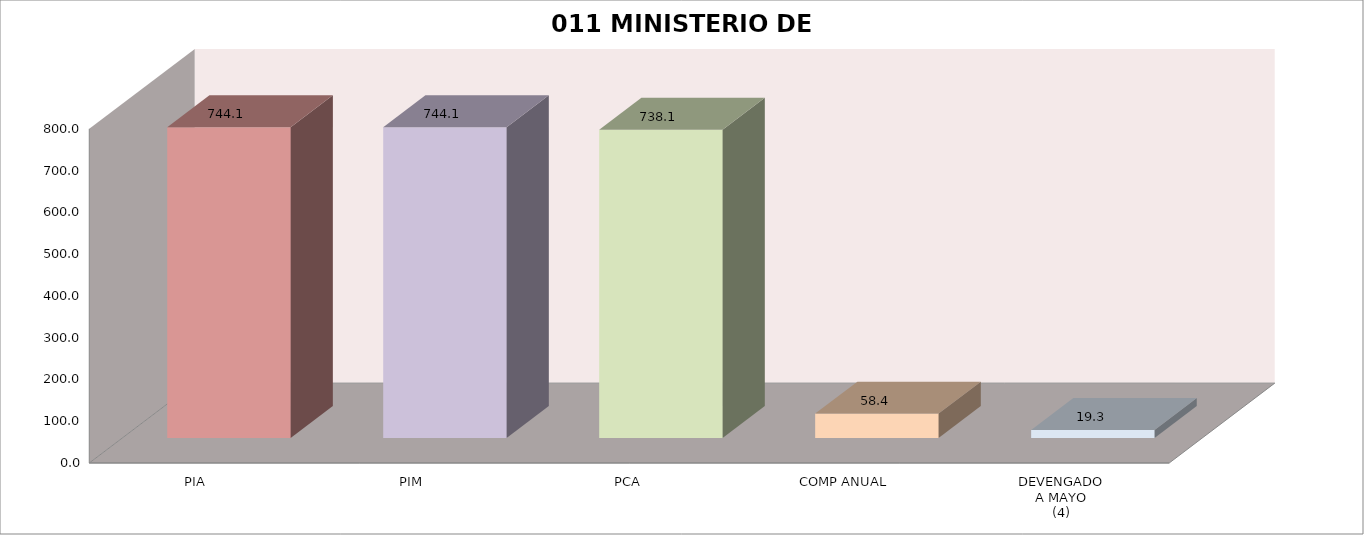
| Category | 011 MINISTERIO DE SALUD |
|---|---|
| PIA | 744.088 |
| PIM | 744.088 |
| PCA | 738.088 |
| COMP ANUAL | 58.416 |
| DEVENGADO
A MAYO
(4) | 19.293 |